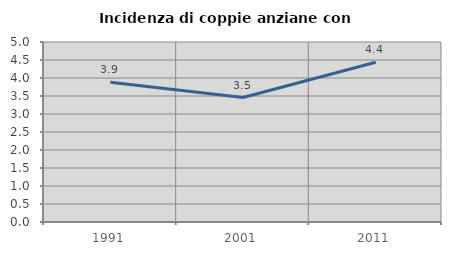
| Category | Incidenza di coppie anziane con figli |
|---|---|
| 1991.0 | 3.881 |
| 2001.0 | 3.458 |
| 2011.0 | 4.439 |